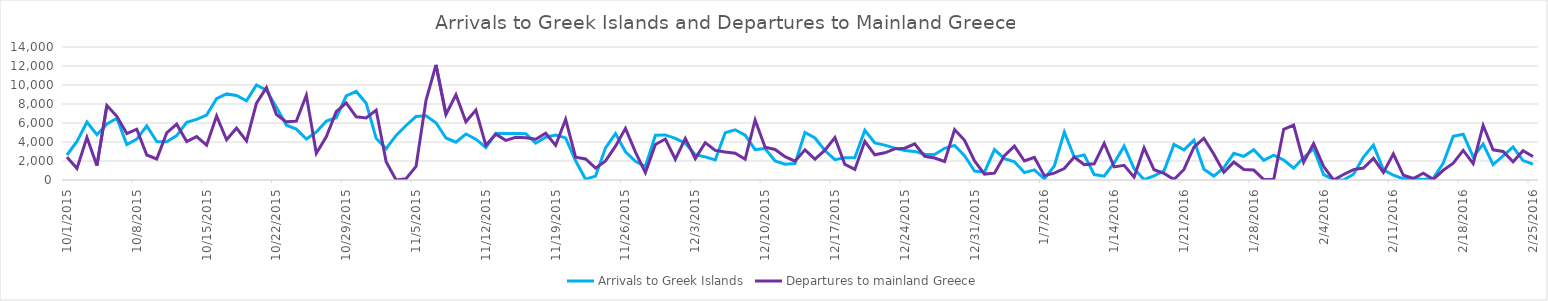
| Category | Arrivals to Greek Islands | Departures to mainland Greece |
|---|---|---|
| 10/1/15 | 2631 | 2409 |
| 10/2/15 | 4055 | 1215 |
| 10/3/15 | 6097 | 4480 |
| 10/4/15 | 4763 | 1513 |
| 10/5/15 | 5909 | 7833 |
| 10/6/15 | 6496 | 6707 |
| 10/7/15 | 3734 | 4886 |
| 10/8/15 | 4295 | 5349 |
| 10/9/15 | 5695 | 2631 |
| 10/10/15 | 4045 | 2214 |
| 10/11/15 | 4034 | 4950 |
| 10/12/15 | 4671 | 5879 |
| 10/13/15 | 6079 | 4052 |
| 10/14/15 | 6380 | 4564 |
| 10/15/15 | 6830 | 3660 |
| 10/16/15 | 8564 | 6743 |
| 10/17/15 | 9063 | 4239 |
| 10/18/15 | 8900 | 5457 |
| 10/19/15 | 8337 | 4119 |
| 10/20/15 | 10006 | 8083 |
| 10/21/15 | 9444 | 9725 |
| 10/22/15 | 7651 | 6896 |
| 10/23/15 | 5762 | 6120 |
| 10/24/15 | 5354 | 6195 |
| 10/25/15 | 4311 | 8916 |
| 10/26/15 | 5049 | 2804 |
| 10/27/15 | 6195 | 4540 |
| 10/28/15 | 6557 | 7191 |
| 10/29/15 | 8847 | 8117 |
| 10/30/15 | 9323 | 6649 |
| 10/31/15 | 8089 | 6537 |
| 11/1/15 | 4400 | 7360 |
| 11/2/15 | 3290 | 1935 |
| 11/3/15 | 4689 | 0 |
| 11/4/15 | 5740 | 142 |
| 11/5/15 | 6679 | 1430 |
| 11/6/15 | 6765 | 8392 |
| 11/7/15 | 6022 | 12116 |
| 11/8/15 | 4425 | 6902 |
| 11/9/15 | 3979 | 8977 |
| 11/10/15 | 4842 | 6133 |
| 11/11/15 | 4296 | 7354 |
| 11/12/15 | 3425 | 3650 |
| 11/13/15 | 4909 | 4820 |
| 11/14/15 | 4884 | 4171 |
| 11/15/15 | 4891 | 4497 |
| 11/16/15 | 4873 | 4442 |
| 11/17/15 | 3873 | 4289 |
| 11/18/15 | 4499 | 4927 |
| 11/19/15 | 4737 | 3644 |
| 11/20/15 | 4432 | 6389 |
| 11/21/15 | 2020 | 2401 |
| 11/22/15 | 76 | 2214 |
| 11/23/15 | 409 | 1245 |
| 11/24/15 | 3383 | 2006 |
| 11/25/15 | 4889 | 3565 |
| 11/26/15 | 2973 | 5435 |
| 11/27/15 | 1961 | 2932 |
| 11/28/15 | 1420 | 778 |
| 11/29/15 | 4703 | 3736 |
| 11/30/15 | 4744 | 4318 |
| 12/1/15 | 4386 | 2181 |
| 12/2/15 | 3863 | 4384 |
| 12/3/15 | 2671 | 2255 |
| 12/4/15 | 2435 | 3934 |
| 12/5/15 | 2110 | 3115 |
| 12/6/15 | 4978 | 2943 |
| 12/7/15 | 5287 | 2810 |
| 12/8/15 | 4721 | 2189 |
| 12/9/15 | 3203 | 6316 |
| 12/10/15 | 3308 | 3456 |
| 12/11/15 | 1999 | 3219 |
| 12/12/15 | 1671 | 2453 |
| 12/13/15 | 1738 | 1976 |
| 12/14/15 | 5005 | 3175 |
| 12/15/15 | 4421 | 2191 |
| 12/16/15 | 3105 | 3137 |
| 12/17/15 | 2135 | 4461 |
| 12/18/15 | 2330 | 1638 |
| 12/19/15 | 2373 | 1110 |
| 12/20/15 | 5223 | 4070 |
| 12/21/15 | 3904 | 2652 |
| 12/22/15 | 3668 | 2864 |
| 12/23/15 | 3354 | 3278 |
| 12/24/15 | 3110 | 3349 |
| 12/25/15 | 3008 | 3806 |
| 12/26/15 | 2710 | 2498 |
| 12/27/15 | 2678 | 2311 |
| 12/28/15 | 3337 | 1946 |
| 12/29/15 | 3643 | 5309 |
| 12/30/15 | 2552 | 4178 |
| 12/31/15 | 948 | 2009 |
| 1/1/16 | 828 | 623 |
| 1/2/16 | 3203 | 720 |
| 1/3/16 | 2241 | 2569 |
| 1/4/16 | 1917 | 3563 |
| 1/5/16 | 779 | 1998 |
| 1/6/16 | 1067 | 2377 |
| 1/7/16 | 119 | 463 |
| 1/8/16 | 1475 | 716 |
| 1/9/16 | 5050 | 1203 |
| 1/10/16 | 2410 | 2417 |
| 1/11/16 | 2645 | 1621 |
| 1/12/16 | 571 | 1701 |
| 1/13/16 | 408 | 3861 |
| 1/14/16 | 1792 | 1378 |
| 1/15/16 | 3564 | 1551 |
| 1/16/16 | 1188 | 301 |
| 1/17/16 | 39 | 3378 |
| 1/18/16 | 435 | 1078 |
| 1/19/16 | 964 | 695 |
| 1/20/16 | 3748 | 50 |
| 1/21/16 | 3166 | 1108 |
| 1/22/16 | 4176 | 3451 |
| 1/23/16 | 1124 | 4397 |
| 1/24/16 | 418 | 2706 |
| 1/25/16 | 1295 | 819 |
| 1/26/16 | 2808 | 1887 |
| 1/27/16 | 2488 | 1098 |
| 1/28/16 | 3180 | 1046 |
| 1/29/16 | 2076 | 40 |
| 1/30/16 | 2623 | 53 |
| 1/31/16 | 2105 | 5342 |
| 2/1/16 | 1244 | 5783 |
| 2/2/16 | 2368 | 1878 |
| 2/3/16 | 3299 | 3829 |
| 2/4/16 | 565 | 1436 |
| 2/5/16 | 38 | 0 |
| 2/6/16 | 7 | 578 |
| 2/7/16 | 608 | 1097 |
| 2/8/16 | 2418 | 1259 |
| 2/9/16 | 3676 | 2283 |
| 2/10/16 | 1071 | 793 |
| 2/11/16 | 502 | 2756 |
| 2/12/16 | 123 | 496 |
| 2/13/16 | 186 | 161 |
| 2/14/16 | 51 | 724 |
| 2/15/16 | 181 | 65 |
| 2/16/16 | 1783 | 1024 |
| 2/17/16 | 4611 | 1772 |
| 2/18/16 | 4824 | 3118 |
| 2/19/16 | 2440 | 1731 |
| 2/20/16 | 3772 | 5738 |
| 2/21/16 | 1618 | 3180 |
| 2/22/16 | 2545 | 3002 |
| 2/23/16 | 3474 | 1927 |
| 2/24/16 | 2044 | 3086 |
| 2/25/16 | 1675 | 2468 |